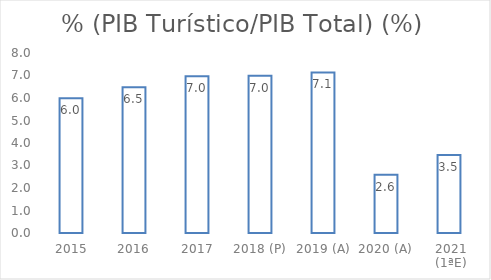
| Category | % (PIB Turístico/PIB Total) (%) |
|---|---|
| 2015 | 5.991 |
| 2016 | 6.483 |
| 2017 | 6.964 |
| 2018 (P) | 6.987 |
| 2019 (A) | 7.137 |
| 2020 (A) | 2.591 |
| 2021 (1ªE) | 3.467 |